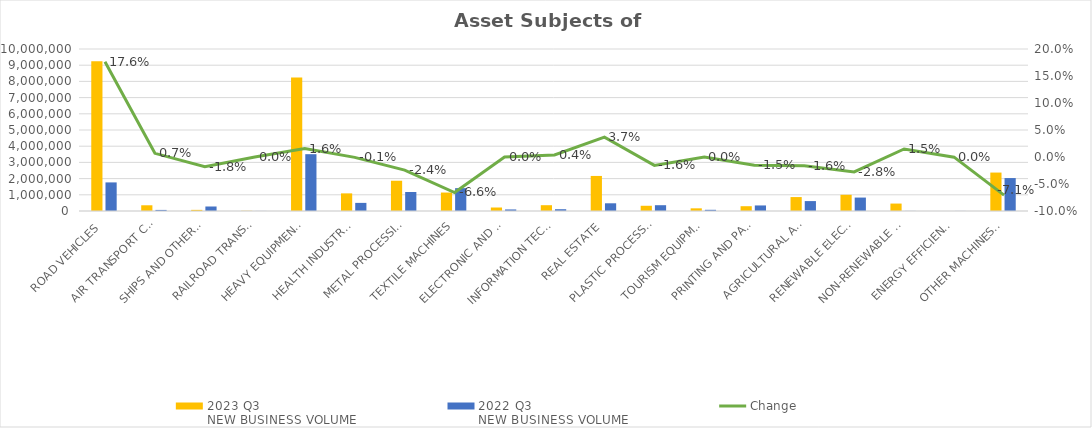
| Category | 2023 Q3 
NEW BUSINESS VOLUME
 TL | 2022 Q3 
NEW BUSINESS VOLUME
 TL |
|---|---|---|
| ROAD VEHICLES | 9247449.053 | 1765147.1 |
| AIR TRANSPORT CONVEYANCE | 353031 | 66604 |
| SHIPS AND OTHER SEA-GOING VESSELS | 70126.241 | 277990.868 |
| RAILROAD TRANSPORT VEHICLES | 13331 | 3944 |
| HEAVY EQUIPMENT AND CONSTRUCTION MACHINERY | 8243644.081 | 3506913.584 |
| HEALTH INDUSTRY AND AESTHETIC INSTRUMENTS | 1088274.495 | 500740.359 |
| METAL PROCESSING MACHINE | 1867906.336 | 1174083.776 |
| TEXTILE MACHINES | 1139169.514 | 1411215.371 |
| ELECTRONIC AND OPTICAL DEVICES | 215475.852 | 96028.759 |
| INFORMATION TECHNOLOGIES AND OFFICE SYSTEMS | 358112.661 | 110060.118 |
| REAL ESTATE | 2164077.097 | 476141 |
| PLASTIC PROCESSING MACHINES | 322630.713 | 357907.05 |
| TOURISM EQUIPMENT | 164379.767 | 73719.217 |
| PRINTING AND PAPER PROCESSING MACHINES | 296230.065 | 342679.924 |
| AGRICULTURAL AND LIVESTOCK FARMING MACHINES | 860096.807 | 612015.652 |
| RENEWABLE ELECTRICITY GENERATION | 1000952.609 | 829330.93 |
| NON-RENEWABLE ELECTRIC ENERGY GENERATION | 458773 | 5003.788 |
| ENERGY EFFICIENCY EQUIPMENT | 0 | 3838 |
| OTHER MACHINES AND EQUIPMENT | 2372860.161 | 2033147.214 |